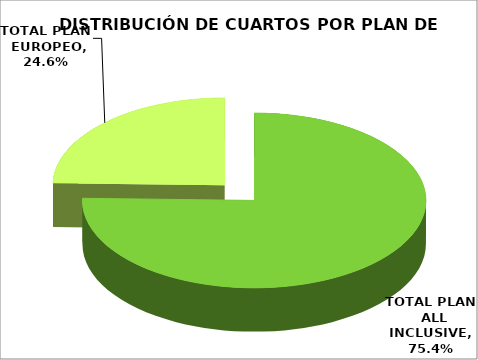
| Category | TOTAL PLAN  ALL INCLUSIVE TOTAL PLAN  EUROPEO |
|---|---|
| TOTAL PLAN  ALL INCLUSIVE | 0.754 |
| TOTAL PLAN  EUROPEO | 0.246 |